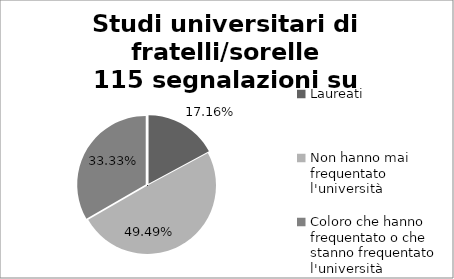
| Category | Series 0 |
|---|---|
| Laureati | 0.172 |
| Non hanno mai frequentato l'università | 0.495 |
| Coloro che hanno frequentato o che stanno frequentato l'università | 0.333 |